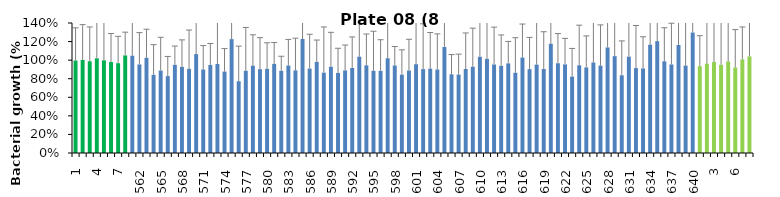
| Category | 8 h % |
|---|---|
| 1.0 | 0.996 |
| 2.0 | 1.001 |
| 3.0 | 0.988 |
| 4.0 | 1.02 |
| 5.0 | 0.998 |
| 6.0 | 0.98 |
| 7.0 | 0.967 |
| 8.0 | 1.051 |
| 561.0 | 1.048 |
| 562.0 | 0.954 |
| 563.0 | 1.025 |
| 564.0 | 0.842 |
| 565.0 | 0.888 |
| 566.0 | 0.828 |
| 567.0 | 0.949 |
| 568.0 | 0.927 |
| 569.0 | 0.906 |
| 570.0 | 1.065 |
| 571.0 | 0.9 |
| 572.0 | 0.949 |
| 573.0 | 0.959 |
| 574.0 | 0.877 |
| 575.0 | 1.227 |
| 576.0 | 0.773 |
| 577.0 | 0.885 |
| 578.0 | 0.94 |
| 579.0 | 0.903 |
| 580.0 | 0.906 |
| 581.0 | 0.96 |
| 582.0 | 0.885 |
| 583.0 | 0.942 |
| 584.0 | 0.89 |
| 585.0 | 1.228 |
| 586.0 | 0.909 |
| 587.0 | 0.981 |
| 588.0 | 0.865 |
| 589.0 | 0.928 |
| 590.0 | 0.863 |
| 591.0 | 0.889 |
| 592.0 | 0.916 |
| 593.0 | 1.037 |
| 594.0 | 0.944 |
| 595.0 | 0.885 |
| 596.0 | 0.884 |
| 597.0 | 1.021 |
| 598.0 | 0.943 |
| 599.0 | 0.844 |
| 600.0 | 0.888 |
| 601.0 | 0.956 |
| 602.0 | 0.903 |
| 603.0 | 0.908 |
| 604.0 | 0.899 |
| 605.0 | 1.142 |
| 606.0 | 0.848 |
| 607.0 | 0.844 |
| 608.0 | 0.905 |
| 609.0 | 0.929 |
| 610.0 | 1.036 |
| 611.0 | 1.014 |
| 612.0 | 0.953 |
| 613.0 | 0.939 |
| 614.0 | 0.965 |
| 615.0 | 0.864 |
| 616.0 | 1.028 |
| 617.0 | 0.903 |
| 618.0 | 0.952 |
| 619.0 | 0.904 |
| 620.0 | 1.177 |
| 621.0 | 0.967 |
| 622.0 | 0.954 |
| 623.0 | 0.823 |
| 624.0 | 0.945 |
| 625.0 | 0.921 |
| 626.0 | 0.974 |
| 627.0 | 0.941 |
| 628.0 | 1.137 |
| 629.0 | 1.043 |
| 630.0 | 0.837 |
| 631.0 | 1.037 |
| 632.0 | 0.915 |
| 633.0 | 0.911 |
| 634.0 | 1.166 |
| 635.0 | 1.205 |
| 636.0 | 0.987 |
| 637.0 | 0.954 |
| 638.0 | 1.164 |
| 639.0 | 0.941 |
| 640.0 | 1.297 |
| 1.0 | 0.935 |
| 2.0 | 0.962 |
| 3.0 | 0.98 |
| 4.0 | 0.949 |
| 5.0 | 0.985 |
| 6.0 | 0.921 |
| 7.0 | 1.008 |
| 8.0 | 1.04 |